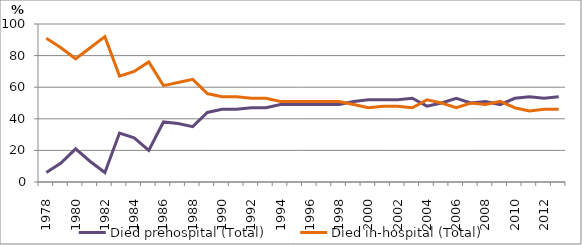
| Category | Died prehospital (Total) | Died in-hospital (Total) |
|---|---|---|
| 1978.0 | 6 | 91 |
| 1979.0 | 12 | 85 |
| 1980.0 | 21 | 78 |
| 1981.0 | 13 | 85 |
| 1982.0 | 6 | 92 |
| 1983.0 | 31 | 67 |
| 1984.0 | 28 | 70 |
| 1985.0 | 20 | 76 |
| 1986.0 | 38 | 61 |
| 1987.0 | 37 | 63 |
| 1988.0 | 35 | 65 |
| 1989.0 | 44 | 56 |
| 1990.0 | 46 | 54 |
| 1991.0 | 46 | 54 |
| 1992.0 | 47 | 53 |
| 1993.0 | 47 | 53 |
| 1994.0 | 49 | 51 |
| 1995.0 | 49 | 51 |
| 1996.0 | 49 | 51 |
| 1997.0 | 49 | 51 |
| 1998.0 | 49 | 51 |
| 1999.0 | 51 | 49 |
| 2000.0 | 52 | 47 |
| 2001.0 | 52 | 48 |
| 2002.0 | 52 | 48 |
| 2003.0 | 53 | 47 |
| 2004.0 | 48 | 52 |
| 2005.0 | 50 | 50 |
| 2006.0 | 53 | 47 |
| 2007.0 | 50 | 50 |
| 2008.0 | 51 | 49 |
| 2009.0 | 49 | 51 |
| 2010.0 | 53 | 47 |
| 2011.0 | 54 | 45 |
| 2012.0 | 53 | 46 |
| 2013.0 | 54 | 46 |